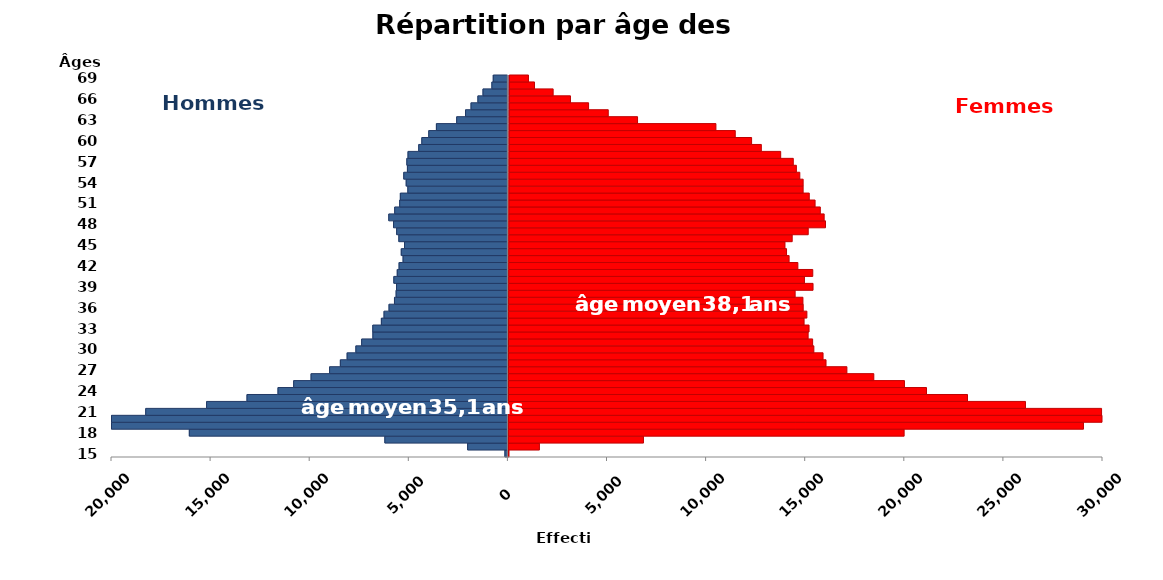
| Category | age | Homme | Femme |
|---|---|---|---|
| 15.0 | 15 | -151 | 65 |
| 16.0 | 16 | -2032 | 1599 |
| 17.0 | 17 | -6208 | 6848 |
| 18.0 | 18 | -16073 | 19999 |
| 19.0 | 19 | -20844 | 29046 |
| 20.0 | 20 | -20495 | 31112 |
| 21.0 | 21 | -18273 | 29957 |
| 22.0 | 22 | -15202 | 26117 |
| 23.0 | 23 | -13163 | 23191 |
| 24.0 | 24 | -11599 | 21122 |
| 25.0 | 25 | -10808 | 20008 |
| 26.0 | 26 | -9931 | 18461 |
| 27.0 | 27 | -8996 | 17102 |
| 28.0 | 28 | -8453 | 16048 |
| 29.0 | 29 | -8111 | 15897 |
| 30.0 | 30 | -7670 | 15432 |
| 31.0 | 31 | -7378 | 15369 |
| 32.0 | 32 | -6811 | 15141 |
| 33.0 | 33 | -6816 | 15187 |
| 34.0 | 34 | -6383 | 14935 |
| 35.0 | 35 | -6249 | 15075 |
| 36.0 | 36 | -5997 | 14889 |
| 37.0 | 37 | -5723 | 14874 |
| 38.0 | 38 | -5639 | 14480 |
| 39.0 | 39 | -5619 | 15382 |
| 40.0 | 40 | -5755 | 14947 |
| 41.0 | 41 | -5582 | 15366 |
| 42.0 | 42 | -5490 | 14613 |
| 43.0 | 43 | -5288 | 14170 |
| 44.0 | 44 | -5380 | 14040 |
| 45.0 | 45 | -5215 | 13960 |
| 46.0 | 46 | -5502 | 14323 |
| 47.0 | 47 | -5612 | 15131 |
| 48.0 | 48 | -5770 | 16001 |
| 49.0 | 49 | -6010 | 15933 |
| 50.0 | 50 | -5711 | 15738 |
| 51.0 | 51 | -5459 | 15473 |
| 52.0 | 52 | -5426 | 15179 |
| 53.0 | 53 | -5048 | 14868 |
| 54.0 | 54 | -5131 | 14868 |
| 55.0 | 55 | -5254 | 14698 |
| 56.0 | 56 | -5069 | 14524 |
| 57.0 | 57 | -5098 | 14367 |
| 58.0 | 58 | -5039 | 13731 |
| 59.0 | 59 | -4499 | 12753 |
| 60.0 | 60 | -4343 | 12261 |
| 61.0 | 61 | -3992 | 11435 |
| 62.0 | 62 | -3607 | 10458 |
| 63.0 | 63 | -2584 | 6504 |
| 64.0 | 64 | -2137 | 5025 |
| 65.0 | 65 | -1860 | 4031 |
| 66.0 | 66 | -1513 | 3116 |
| 67.0 | 67 | -1256 | 2241 |
| 68.0 | 68 | -808 | 1299 |
| 69.0 | 69 | -739 | 994 |